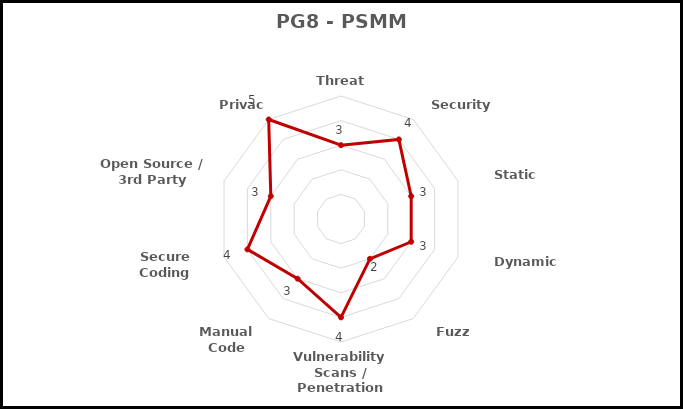
| Category | Technical Parameters |
|---|---|
| Threat Modeling | 3 |
| Security Testing | 4 |
| Static Analysis | 3 |
| Dynamic Analysis | 3 |
| Fuzz Testing | 2 |
| Vulnerability Scans / Penetration Testing | 4 |
| Manual Code Reviews | 3 |
| Secure Coding Standards | 4 |
| Open Source / 3rd Party Libraries | 3 |
| Privacy | 5 |